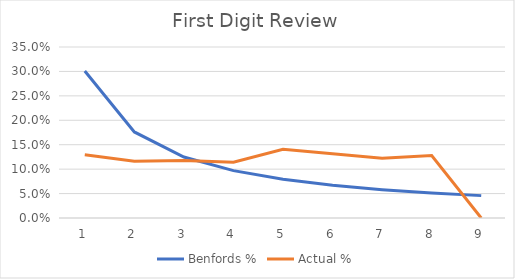
| Category | Benfords % | Actual % |
|---|---|---|
| 1.0 | 0.301 | 0.13 |
| 2.0 | 0.176 | 0.116 |
| 3.0 | 0.125 | 0.118 |
| 4.0 | 0.097 | 0.114 |
| 5.0 | 0.079 | 0.14 |
| 6.0 | 0.067 | 0.132 |
| 7.0 | 0.058 | 0.122 |
| 8.0 | 0.051 | 0.128 |
| 9.0 | 0.046 | 0 |